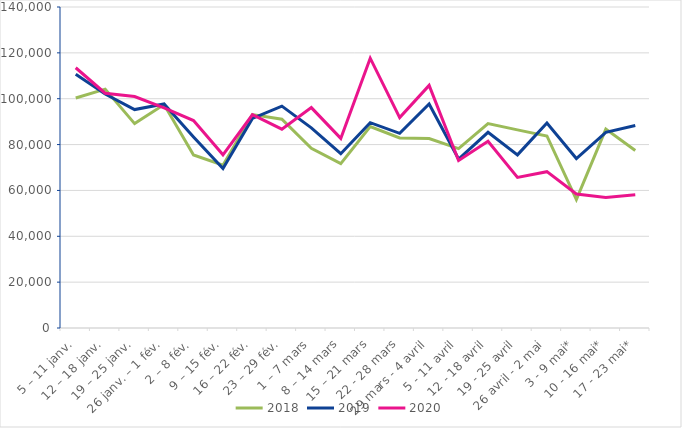
| Category | 2018 | 2019 | 2020 |
|---|---|---|---|
| 5 – 11 janv. | 100330 | 110701 | 113506 |
| 12 – 18 janv. | 104190 | 102045 | 102407 |
| 19 – 25 janv. | 89142 | 95260 | 100966 |
| 26 janv. – 1 fév. | 97441 | 97699 | 96042 |
| 2 – 8 fév. | 75434 | 83347 | 90495 |
| 9 – 15 fév. | 71031 | 69559 | 75523 |
| 16 – 22 fév. | 93102 | 91428 | 93003 |
| 23 – 29 fév. | 91065 | 96774 | 86699 |
| 1 – 7 mars | 78415 | 87314 | 96119 |
| 8 – 14 mars | 71697 | 76021 | 82690 |
| 15 – 21 mars | 87845 | 89536 | 117673 |
| 22 - 28 mars | 82895 | 84912 | 91763.636 |
| 29 mars - 4 avril | 82654 | 97699 | 105802 |
| 5 - 11 avril | 78244 | 73699 | 73060.606 |
| 12 - 18 avril | 89129 | 85348 | 81477 |
| 19 - 25 avril | 86398 | 75509 | 65653 |
| 26 avril - 2 mai | 83743 | 89413 | 68188 |
| 3 - 9 mai* | 56008 | 73891 | 58423 |
| 10 - 16 mai* | 86722 | 85364 | 56968.687 |
| 17 - 23 mai* | 77423 | 88345 | 58132.642 |